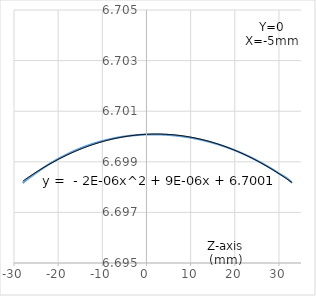
| Category | Series 0 |
|---|---|
| -28.0 | 6.698 |
| -27.0 | 6.698 |
| -26.0 | 6.698 |
| -25.0 | 6.699 |
| -24.0 | 6.699 |
| -23.0 | 6.699 |
| -22.0 | 6.699 |
| -21.0 | 6.699 |
| -20.0 | 6.699 |
| -19.0 | 6.699 |
| -18.0 | 6.699 |
| -17.0 | 6.699 |
| -16.0 | 6.699 |
| -15.0 | 6.7 |
| -14.0 | 6.7 |
| -13.0 | 6.7 |
| -12.0 | 6.7 |
| -11.0 | 6.7 |
| -10.0 | 6.7 |
| -9.0 | 6.7 |
| -8.0 | 6.7 |
| -7.0 | 6.7 |
| -6.0 | 6.7 |
| -5.0 | 6.7 |
| -4.0 | 6.7 |
| -3.0 | 6.7 |
| -2.0 | 6.7 |
| -1.0 | 6.7 |
| 0.0 | 6.7 |
| 1.0 | 6.7 |
| 2.0 | 6.7 |
| 3.0 | 6.7 |
| 4.0 | 6.7 |
| 5.0 | 6.7 |
| 6.0 | 6.7 |
| 7.0 | 6.7 |
| 8.0 | 6.7 |
| 9.0 | 6.7 |
| 10.0 | 6.7 |
| 11.0 | 6.7 |
| 12.0 | 6.7 |
| 13.0 | 6.7 |
| 14.0 | 6.7 |
| 15.0 | 6.7 |
| 16.0 | 6.7 |
| 17.0 | 6.7 |
| 18.0 | 6.7 |
| 19.0 | 6.7 |
| 20.0 | 6.699 |
| 21.0 | 6.699 |
| 22.0 | 6.699 |
| 23.0 | 6.699 |
| 24.0 | 6.699 |
| 25.0 | 6.699 |
| 26.0 | 6.699 |
| 27.0 | 6.699 |
| 28.0 | 6.699 |
| 29.0 | 6.699 |
| 30.0 | 6.699 |
| 31.0 | 6.698 |
| 32.0 | 6.698 |
| 33.0 | 6.698 |